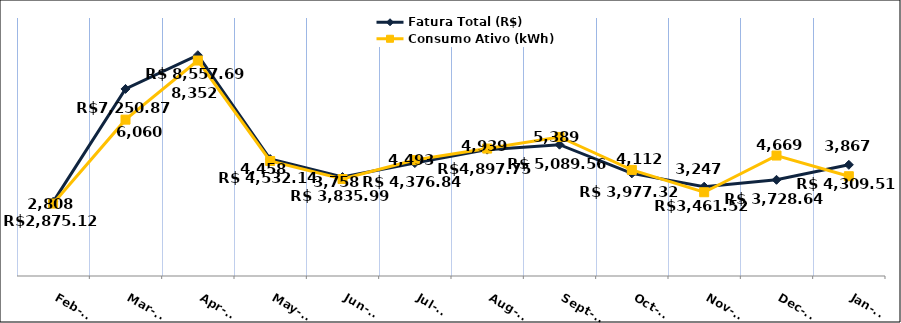
| Category | Fatura Total (R$) |
|---|---|
| 2023-02-01 | 2875.12 |
| 2023-03-01 | 7250.87 |
| 2023-04-01 | 8557.69 |
| 2023-05-01 | 4532.14 |
| 2023-06-01 | 3835.99 |
| 2023-07-01 | 4376.84 |
| 2023-08-01 | 4897.75 |
| 2023-09-01 | 5089.56 |
| 2023-10-01 | 3977.32 |
| 2023-11-01 | 3461.52 |
| 2023-12-01 | 3728.64 |
| 2024-01-01 | 4309.51 |